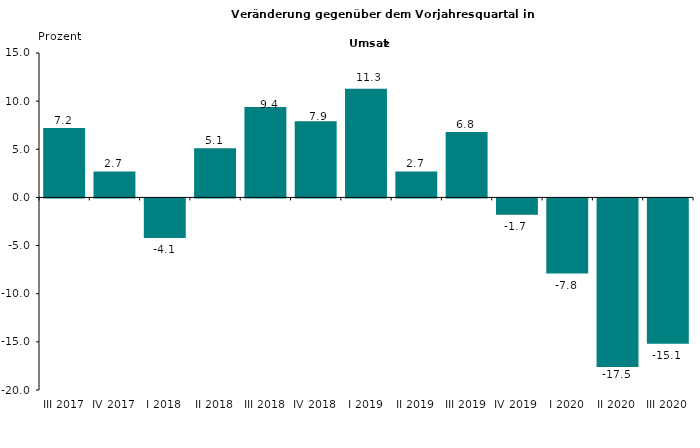
| Category | 7,2 |
|---|---|
| III 2017 | 7.2 |
| IV 2017 | 2.7 |
| I 2018 | -4.1 |
| II 2018 | 5.1 |
| III 2018 | 9.4 |
| IV 2018 | 7.9 |
| I 2019 | 11.3 |
| II 2019 | 2.7 |
| III 2019 | 6.8 |
| IV 2019 | -1.7 |
| I 2020 | -7.8 |
| II 2020 | -17.5 |
| III 2020 | -15.1 |